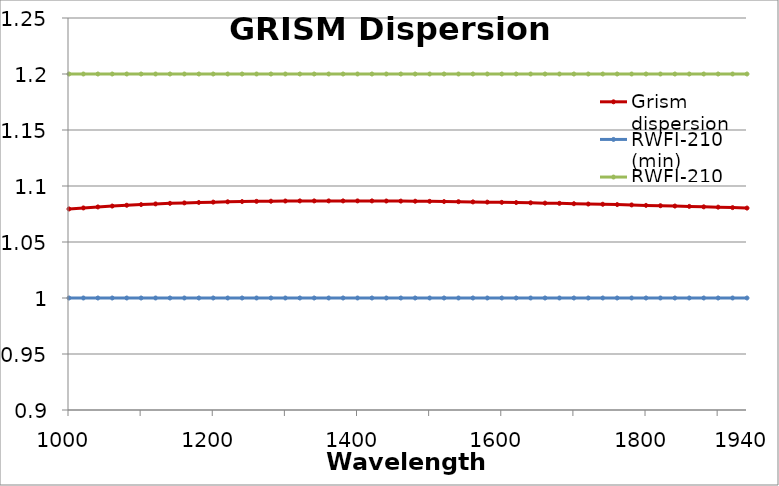
| Category | Grism dispersion | RWFI-210 (min) | RWFI-210 (Max) |
|---|---|---|---|
| 1000.0 | 1.08 | 1 | 1.2 |
| nan | 1.08 | 1 | 1.2 |
| nan | 1.081 | 1 | 1.2 |
| nan | 1.082 | 1 | 1.2 |
| nan | 1.083 | 1 | 1.2 |
| nan | 1.083 | 1 | 1.2 |
| nan | 1.084 | 1 | 1.2 |
| nan | 1.084 | 1 | 1.2 |
| nan | 1.085 | 1 | 1.2 |
| nan | 1.085 | 1 | 1.2 |
| 1200.0 | 1.086 | 1 | 1.2 |
| nan | 1.086 | 1 | 1.2 |
| nan | 1.086 | 1 | 1.2 |
| nan | 1.086 | 1 | 1.2 |
| nan | 1.086 | 1 | 1.2 |
| nan | 1.087 | 1 | 1.2 |
| nan | 1.087 | 1 | 1.2 |
| nan | 1.087 | 1 | 1.2 |
| nan | 1.087 | 1 | 1.2 |
| nan | 1.087 | 1 | 1.2 |
| 1400.0 | 1.087 | 1 | 1.2 |
| nan | 1.087 | 1 | 1.2 |
| nan | 1.087 | 1 | 1.2 |
| nan | 1.086 | 1 | 1.2 |
| nan | 1.086 | 1 | 1.2 |
| nan | 1.086 | 1 | 1.2 |
| nan | 1.086 | 1 | 1.2 |
| nan | 1.086 | 1 | 1.2 |
| nan | 1.086 | 1 | 1.2 |
| nan | 1.086 | 1 | 1.2 |
| 1600.0 | 1.085 | 1 | 1.2 |
| nan | 1.085 | 1 | 1.2 |
| nan | 1.085 | 1 | 1.2 |
| nan | 1.085 | 1 | 1.2 |
| nan | 1.084 | 1 | 1.2 |
| nan | 1.084 | 1 | 1.2 |
| nan | 1.084 | 1 | 1.2 |
| nan | 1.084 | 1 | 1.2 |
| nan | 1.083 | 1 | 1.2 |
| nan | 1.083 | 1 | 1.2 |
| 1800.0 | 1.083 | 1 | 1.2 |
| nan | 1.082 | 1 | 1.2 |
| nan | 1.082 | 1 | 1.2 |
| nan | 1.082 | 1 | 1.2 |
| nan | 1.081 | 1 | 1.2 |
| nan | 1.081 | 1 | 1.2 |
| nan | 1.081 | 1 | 1.2 |
| 1940.0 | 1.08 | 1 | 1.2 |